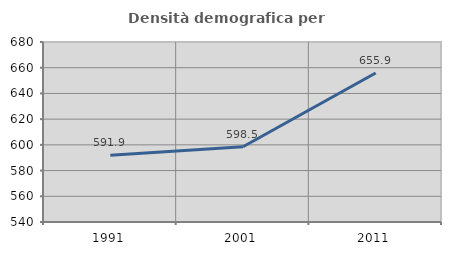
| Category | Densità demografica |
|---|---|
| 1991.0 | 591.936 |
| 2001.0 | 598.536 |
| 2011.0 | 655.895 |